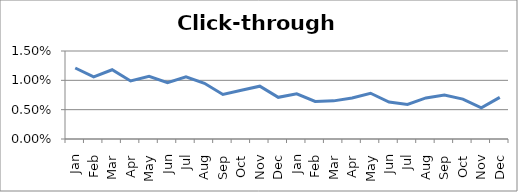
| Category | Click-through Rate |
|---|---|
| Jan | 0.012 |
| Feb | 0.011 |
| Mar | 0.012 |
| Apr | 0.01 |
| May | 0.011 |
| Jun | 0.01 |
| Jul | 0.011 |
| Aug | 0.01 |
| Sep | 0.008 |
| Oct | 0.008 |
| Nov | 0.009 |
| Dec | 0.007 |
| Jan | 0.008 |
| Feb | 0.006 |
| Mar | 0.006 |
| Apr | 0.007 |
| May | 0.008 |
| Jun | 0.006 |
| Jul | 0.006 |
| Aug | 0.007 |
| Sep | 0.008 |
| Oct | 0.007 |
| Nov | 0.005 |
| Dec | 0.007 |